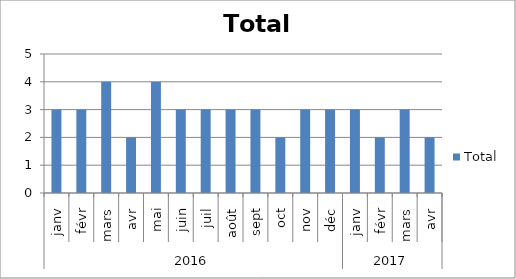
| Category | Total |
|---|---|
| 0 | 3 |
| 1 | 3 |
| 2 | 4 |
| 3 | 2 |
| 4 | 4 |
| 5 | 3 |
| 6 | 3 |
| 7 | 3 |
| 8 | 3 |
| 9 | 2 |
| 10 | 3 |
| 11 | 3 |
| 12 | 3 |
| 13 | 2 |
| 14 | 3 |
| 15 | 2 |